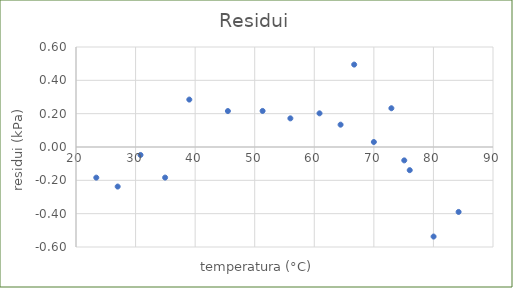
| Category | Series 0 |
|---|---|
| 19.6665718182 | -0.183 |
| 23.4056560389 | -0.184 |
| 26.9990147914 | -0.237 |
| 30.8276182797 | -0.048 |
| 34.9603525856 | -0.184 |
| 39.0201632291 | 0.285 |
| 45.4975226337 | 0.216 |
| 51.3233909923 | 0.216 |
| 55.9860099754 | 0.172 |
| 60.8787261046 | 0.202 |
| 64.4149716386 | 0.134 |
| 66.6973419931 | 0.495 |
| 69.998656876 | 0.03 |
| 72.9428350519 | 0.232 |
| 75.1031044885 | -0.08 |
| 76.0219377379 | -0.139 |
| 80.0264352561 | -0.537 |
| 84.2264677916 | -0.39 |